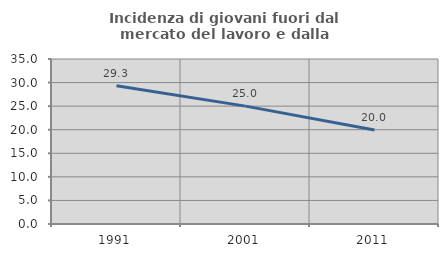
| Category | Incidenza di giovani fuori dal mercato del lavoro e dalla formazione  |
|---|---|
| 1991.0 | 29.34 |
| 2001.0 | 25.002 |
| 2011.0 | 19.96 |